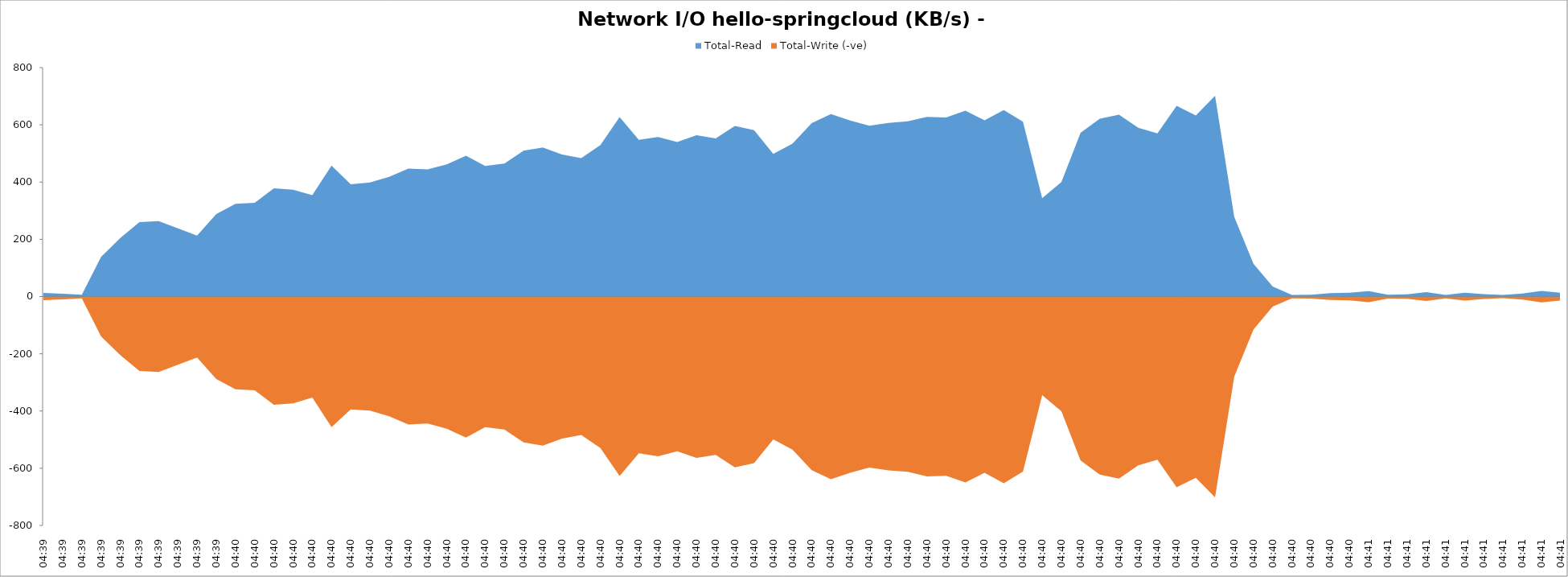
| Category | Total-Read | Total-Write (-ve) |
|---|---|---|
| 04:39 | 12.8 | -12.8 |
| 04:39 | 10 | -10 |
| 04:39 | 6.3 | -6.3 |
| 04:39 | 138.8 | -138.9 |
| 04:39 | 204.5 | -204.5 |
| 04:39 | 260.4 | -260.4 |
| 04:39 | 263.4 | -263.4 |
| 04:39 | 238.1 | -238.1 |
| 04:39 | 212.9 | -212.9 |
| 04:39 | 288.4 | -288.4 |
| 04:40 | 324 | -324 |
| 04:40 | 327.4 | -327.4 |
| 04:40 | 378.5 | -378.5 |
| 04:40 | 373.6 | -373.6 |
| 04:40 | 354.1 | -353.2 |
| 04:40 | 457.3 | -456.5 |
| 04:40 | 392.5 | -394.5 |
| 04:40 | 398.3 | -398.3 |
| 04:40 | 418.3 | -418.2 |
| 04:40 | 447.4 | -447.2 |
| 04:40 | 444 | -443.9 |
| 04:40 | 462 | -462 |
| 04:40 | 492.4 | -492.5 |
| 04:40 | 456.5 | -456.1 |
| 04:40 | 464.7 | -464.7 |
| 04:40 | 509.7 | -509.7 |
| 04:40 | 520.7 | -520.7 |
| 04:40 | 496 | -496 |
| 04:40 | 483.5 | -483.5 |
| 04:40 | 529.5 | -529.4 |
| 04:40 | 627.3 | -626.9 |
| 04:40 | 547.8 | -547.6 |
| 04:40 | 557.7 | -558 |
| 04:40 | 540 | -540.8 |
| 04:40 | 563.5 | -564 |
| 04:40 | 552.8 | -553.3 |
| 04:40 | 596.4 | -597 |
| 04:40 | 581.5 | -581.9 |
| 04:40 | 498.4 | -498.9 |
| 04:40 | 534.6 | -535 |
| 04:40 | 606.1 | -606.5 |
| 04:40 | 637.9 | -638.3 |
| 04:40 | 615.3 | -615.7 |
| 04:40 | 596.8 | -597.2 |
| 04:40 | 607 | -607.4 |
| 04:40 | 612 | -612.4 |
| 04:40 | 627.8 | -628.2 |
| 04:40 | 625.8 | -626.3 |
| 04:40 | 649.3 | -649.8 |
| 04:40 | 615.6 | -616.1 |
| 04:40 | 652 | -652.5 |
| 04:40 | 611 | -611.5 |
| 04:40 | 343.7 | -344.2 |
| 04:40 | 400.1 | -400.6 |
| 04:40 | 572.4 | -572.8 |
| 04:40 | 621.4 | -621.9 |
| 04:40 | 635.7 | -636.1 |
| 04:40 | 589.6 | -590 |
| 04:40 | 570 | -570.1 |
| 04:40 | 666.2 | -666.6 |
| 04:40 | 632.9 | -633.4 |
| 04:40 | 701.4 | -701.8 |
| 04:40 | 278.3 | -279.6 |
| 04:40 | 114.5 | -115 |
| 04:40 | 34.9 | -35.3 |
| 04:40 | 5.8 | -6.2 |
| 04:40 | 6.6 | -6.9 |
| 04:40 | 12 | -12.3 |
| 04:40 | 13.1 | -13.4 |
| 04:41 | 19.1 | -19.5 |
| 04:41 | 6.6 | -7 |
| 04:41 | 7.4 | -7.7 |
| 04:41 | 15.2 | -15.5 |
| 04:41 | 5.7 | -6 |
| 04:41 | 13.5 | -13.8 |
| 04:41 | 8.1 | -8.4 |
| 04:41 | 5.5 | -5.8 |
| 04:41 | 10.3 | -10.6 |
| 04:41 | 19.9 | -20.3 |
| 04:41 | 13.3 | -13.7 |